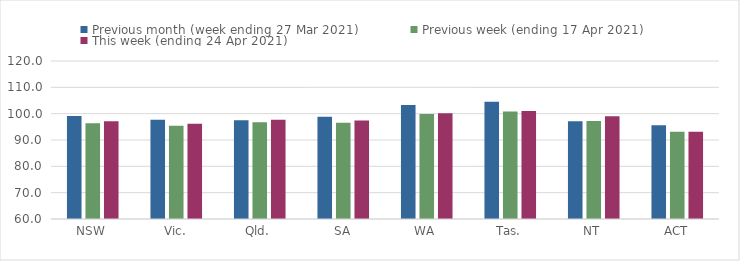
| Category | Previous month (week ending 27 Mar 2021) | Previous week (ending 17 Apr 2021) | This week (ending 24 Apr 2021) |
|---|---|---|---|
| NSW | 99.12 | 96.37 | 97.12 |
| Vic. | 97.72 | 95.39 | 96.2 |
| Qld. | 97.5 | 96.73 | 97.72 |
| SA | 98.8 | 96.56 | 97.39 |
| WA | 103.25 | 99.84 | 100.13 |
| Tas. | 104.48 | 100.78 | 100.97 |
| NT | 97.09 | 97.21 | 99.03 |
| ACT | 95.61 | 93.18 | 93.18 |